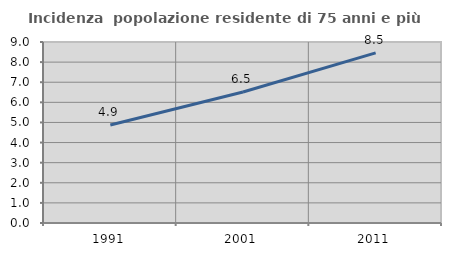
| Category | Incidenza  popolazione residente di 75 anni e più |
|---|---|
| 1991.0 | 4.873 |
| 2001.0 | 6.514 |
| 2011.0 | 8.458 |